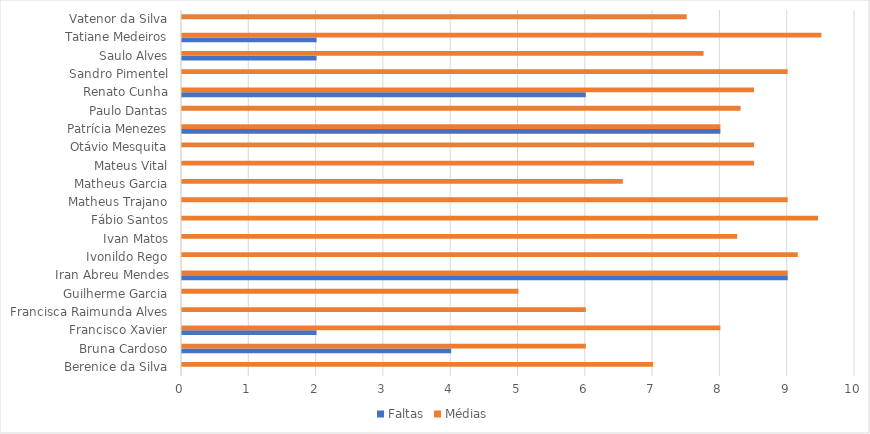
| Category | Faltas | Médias |
|---|---|---|
| Berenice da Silva | 0 | 7 |
| Bruna Cardoso | 4 | 6 |
| Francisco Xavier | 2 | 8 |
| Francisca Raimunda Alves | 0 | 6 |
| Guilherme Garcia | 0 | 5 |
| Iran Abreu Mendes | 9 | 9 |
| Ivonildo Rego | 0 | 9.15 |
| Ivan Matos | 0 | 8.25 |
| Fábio Santos | 0 | 9.45 |
| Matheus Trajano | 0 | 9 |
| Matheus Garcia | 0 | 6.55 |
| Mateus Vital | 0 | 8.5 |
| Otávio Mesquita | 0 | 8.5 |
| Patrícia Menezes | 8 | 8 |
| Paulo Dantas | 0 | 8.3 |
| Renato Cunha | 6 | 8.5 |
| Sandro Pimentel | 0 | 9 |
| Saulo Alves | 2 | 7.75 |
| Tatiane Medeiros | 2 | 9.5 |
| Vatenor da Silva | 0 | 7.5 |